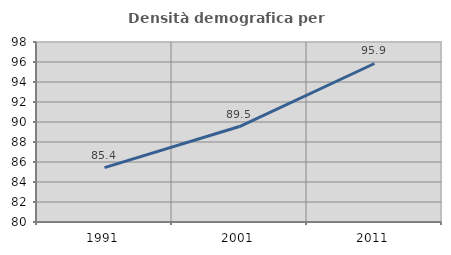
| Category | Densità demografica |
|---|---|
| 1991.0 | 85.442 |
| 2001.0 | 89.547 |
| 2011.0 | 95.852 |